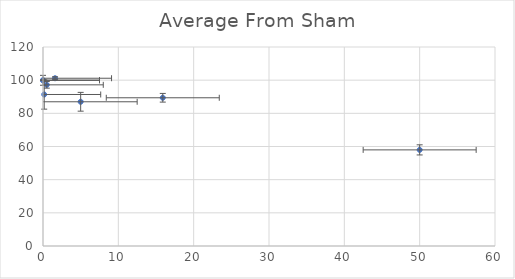
| Category | Average From Sham |
|---|---|
| 50.0 | 57.96 |
| 15.9 | 89.387 |
| 5.0 | 86.967 |
| 1.6 | 101.161 |
| 0.5 | 97.182 |
| 0.16 | 91.36 |
| 0.0 | 100 |
| 0.0 | 99.919 |